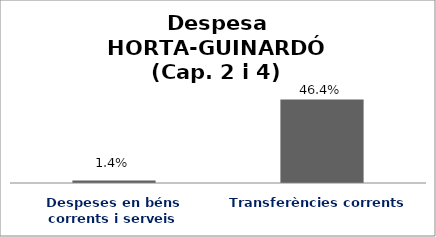
| Category | Series 0 |
|---|---|
| Despeses en béns corrents i serveis | 0.014 |
| Transferències corrents | 0.464 |